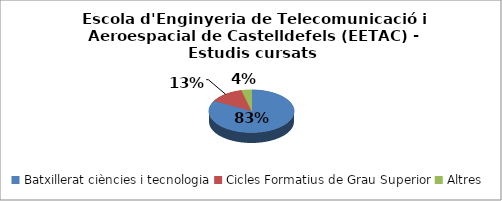
| Category | Escola d'Enginyeria de Telecomunicació i Aeroespacial de Castelldefels (EETAC) - Estudis cursats |
|---|---|
| Batxillerat ciències i tecnologia | 0.83 |
| Cicles Formatius de Grau Superior | 0.132 |
| Altres | 0.038 |